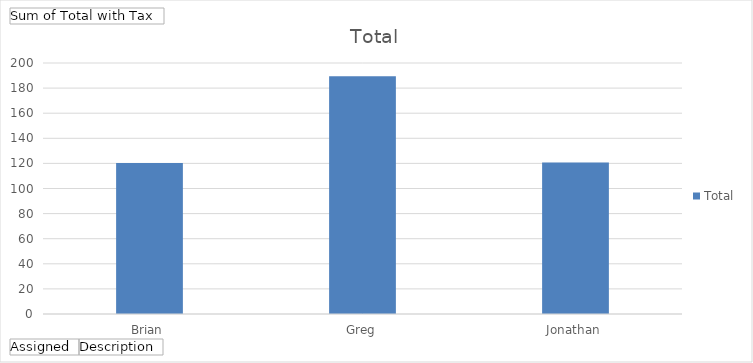
| Category | Total |
|---|---|
| Brian | 120.25 |
| Greg | 189.53 |
| Jonathan | 120.67 |